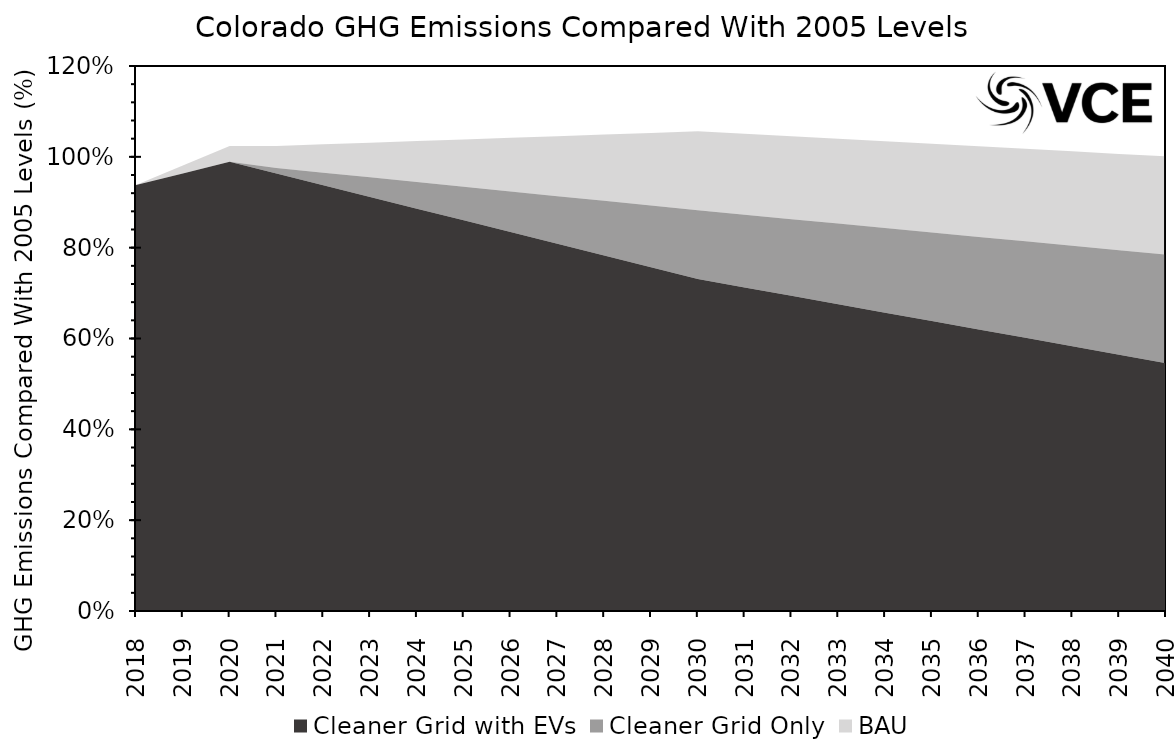
| Category | Cleaner Grid with EVs | Cleaner Grid Only | BAU |
|---|---|---|---|
| 2018.0 | 0.938 | 0 | 0 |
| 2019.0 | 0.963 | 0 | 0.017 |
| 2020.0 | 0.989 | 0 | 0.034 |
| 2021.0 | 0.963 | 0.012 | 0.048 |
| 2022.0 | 0.938 | 0.028 | 0.062 |
| 2023.0 | 0.912 | 0.043 | 0.076 |
| 2024.0 | 0.886 | 0.059 | 0.09 |
| 2025.0 | 0.86 | 0.074 | 0.104 |
| 2026.0 | 0.834 | 0.09 | 0.118 |
| 2027.0 | 0.808 | 0.105 | 0.132 |
| 2028.0 | 0.783 | 0.12 | 0.146 |
| 2029.0 | 0.757 | 0.136 | 0.16 |
| 2030.0 | 0.731 | 0.151 | 0.174 |
| 2031.0 | 0.712 | 0.16 | 0.178 |
| 2032.0 | 0.694 | 0.169 | 0.182 |
| 2033.0 | 0.675 | 0.178 | 0.187 |
| 2034.0 | 0.657 | 0.186 | 0.191 |
| 2035.0 | 0.638 | 0.195 | 0.195 |
| 2036.0 | 0.62 | 0.204 | 0.199 |
| 2037.0 | 0.601 | 0.213 | 0.204 |
| 2038.0 | 0.583 | 0.221 | 0.208 |
| 2039.0 | 0.564 | 0.23 | 0.212 |
| 2040.0 | 0.546 | 0.239 | 0.216 |